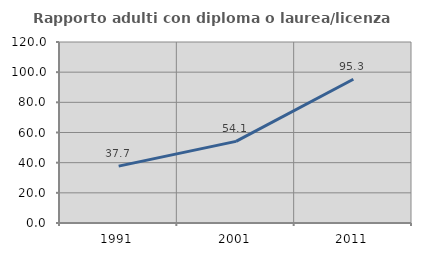
| Category | Rapporto adulti con diploma o laurea/licenza media  |
|---|---|
| 1991.0 | 37.69 |
| 2001.0 | 54.104 |
| 2011.0 | 95.31 |